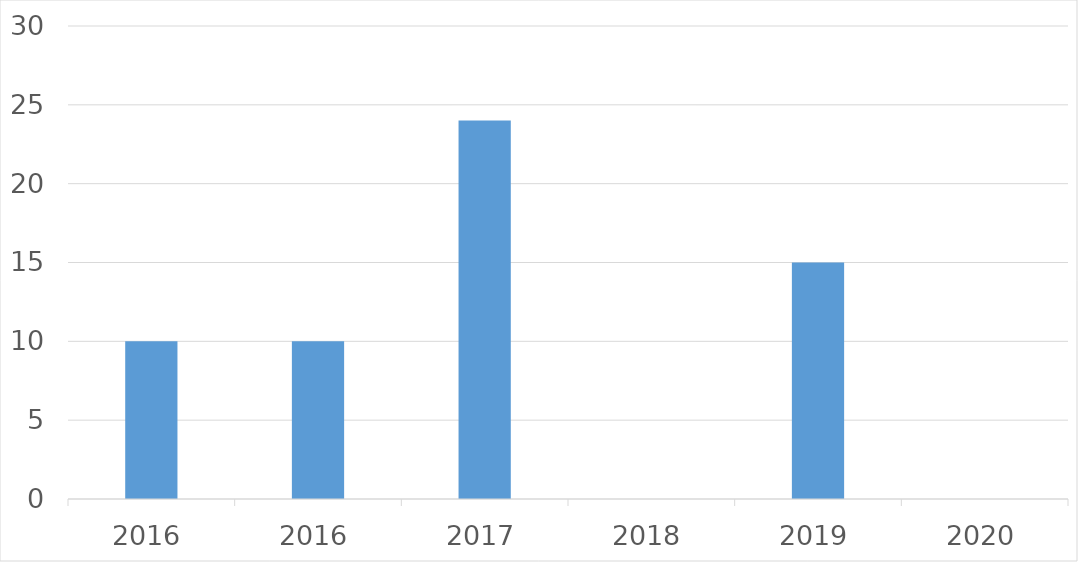
| Category | Series 0 |
|---|---|
| 2016 | 10 |
| 2016 | 10 |
| 2017 | 24 |
| 2018 | 0 |
| 2019 | 15 |
| 2020 | 0 |